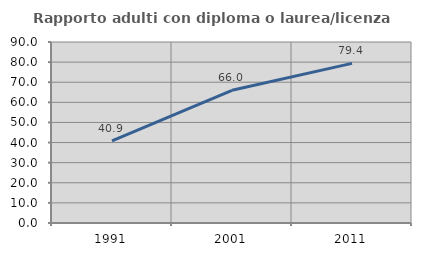
| Category | Rapporto adulti con diploma o laurea/licenza media  |
|---|---|
| 1991.0 | 40.871 |
| 2001.0 | 65.976 |
| 2011.0 | 79.386 |